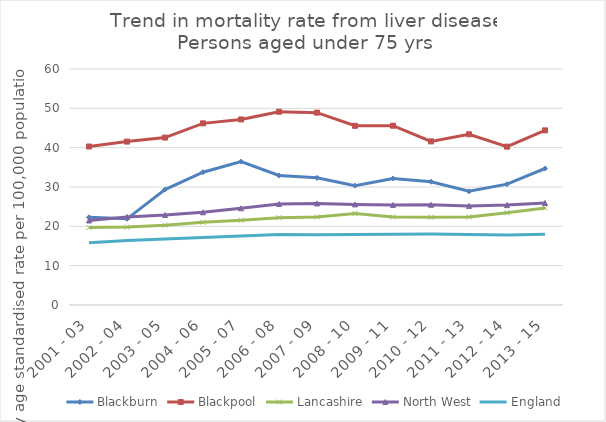
| Category | Blackburn | Blackpool | Lancashire | North West | England |
|---|---|---|---|---|---|
| 2001 - 03 | 22.303 | 40.293 | 19.691 | 21.481 | 15.846 |
| 2002 - 04 | 21.909 | 41.546 | 19.802 | 22.393 | 16.398 |
| 2003 - 05 | 29.352 | 42.567 | 20.301 | 22.872 | 16.779 |
| 2004 - 06 | 33.754 | 46.183 | 21.047 | 23.573 | 17.141 |
| 2005 - 07 | 36.445 | 47.174 | 21.546 | 24.585 | 17.527 |
| 2006 - 08 | 32.916 | 49.143 | 22.198 | 25.669 | 17.932 |
| 2007 - 09 | 32.326 | 48.906 | 22.38 | 25.83 | 17.871 |
| 2008 - 10 | 30.34 | 45.562 | 23.244 | 25.579 | 17.912 |
| 2009 - 11 | 32.164 | 45.584 | 22.403 | 25.435 | 18.003 |
| 2010 - 12 | 31.343 | 41.596 | 22.315 | 25.471 | 18.038 |
| 2011 - 13 | 28.906 | 43.401 | 22.385 | 25.199 | 17.905 |
| 2012 - 14 | 30.732 | 40.26 | 23.446 | 25.394 | 17.777 |
| 2013 - 15 | 34.702 | 44.398 | 24.661 | 25.941 | 17.983 |